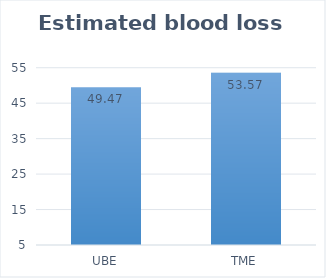
| Category | Series 0 |
|---|---|
| UBE | 49.47 |
| TME | 53.57 |